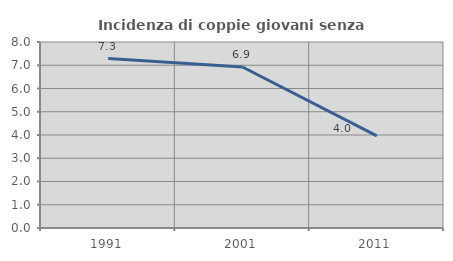
| Category | Incidenza di coppie giovani senza figli |
|---|---|
| 1991.0 | 7.286 |
| 2001.0 | 6.926 |
| 2011.0 | 3.962 |